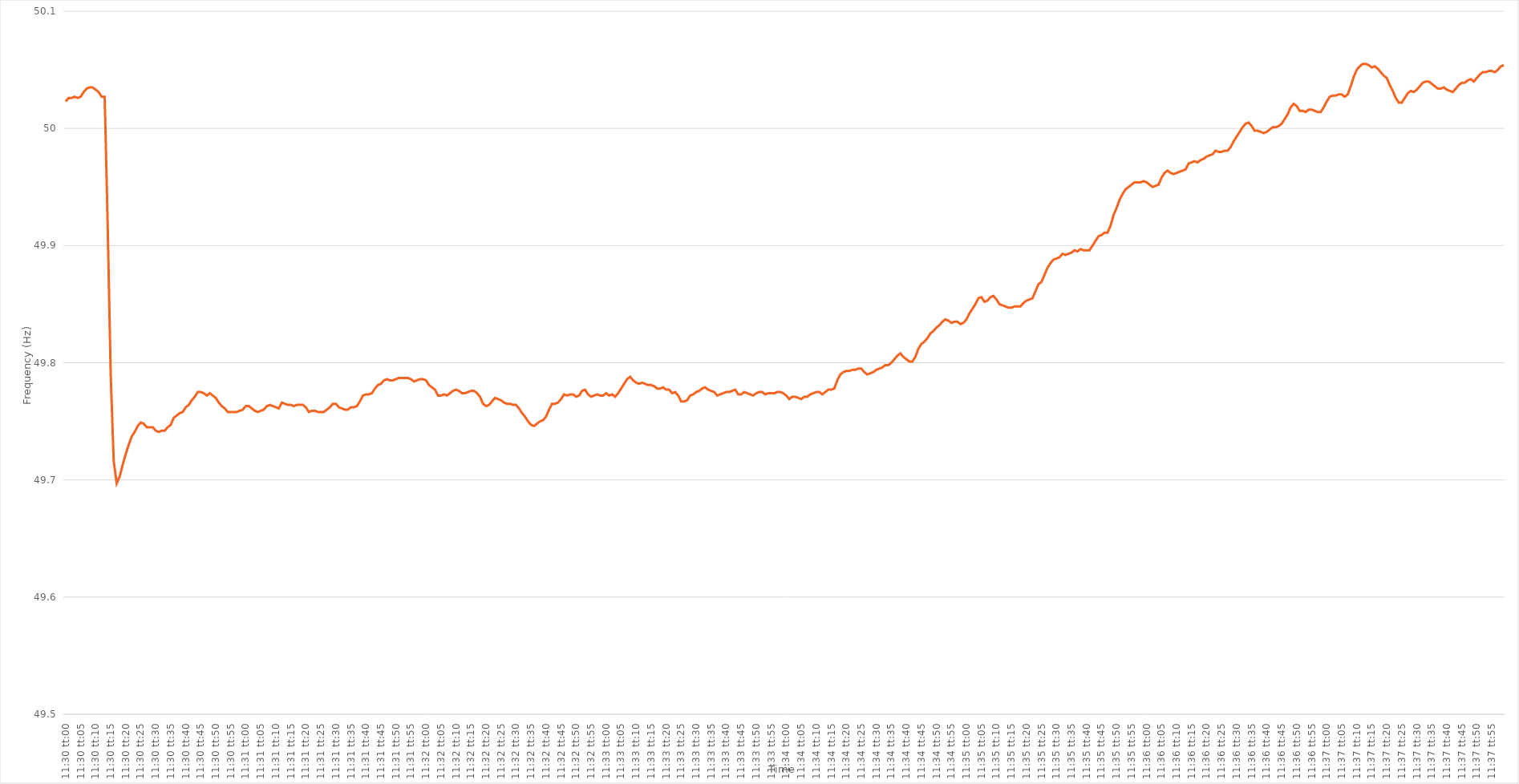
| Category | Series 0 |
|---|---|
| 0.4791666666666667 | 50.023 |
| 0.4791782407407407 | 50.026 |
| 0.4791898148148148 | 50.026 |
| 0.47920138888888886 | 50.027 |
| 0.47921296296296295 | 50.026 |
| 0.479224537037037 | 50.027 |
| 0.47923611111111114 | 50.031 |
| 0.4792476851851852 | 50.034 |
| 0.4792592592592593 | 50.035 |
| 0.4792708333333333 | 50.035 |
| 0.4792824074074074 | 50.033 |
| 0.47929398148148145 | 50.031 |
| 0.4793055555555556 | 50.027 |
| 0.47931712962962963 | 50.027 |
| 0.47932870370370373 | 49.917 |
| 0.47934027777777777 | 49.79 |
| 0.47935185185185186 | 49.716 |
| 0.4793634259259259 | 49.697 |
| 0.47937500000000005 | 49.703 |
| 0.4793865740740741 | 49.713 |
| 0.4793981481481482 | 49.722 |
| 0.4794097222222222 | 49.73 |
| 0.47942129629629626 | 49.737 |
| 0.47943287037037036 | 49.741 |
| 0.4794444444444444 | 49.746 |
| 0.47945601851851855 | 49.749 |
| 0.4794675925925926 | 49.748 |
| 0.4794791666666667 | 49.745 |
| 0.4794907407407407 | 49.745 |
| 0.4795023148148148 | 49.745 |
| 0.47951388888888885 | 49.742 |
| 0.479525462962963 | 49.741 |
| 0.47953703703703704 | 49.742 |
| 0.47954861111111113 | 49.742 |
| 0.4795601851851852 | 49.745 |
| 0.47957175925925927 | 49.747 |
| 0.4795833333333333 | 49.753 |
| 0.47959490740740746 | 49.755 |
| 0.4796064814814815 | 49.757 |
| 0.4796180555555556 | 49.758 |
| 0.47962962962962963 | 49.762 |
| 0.47964120370370367 | 49.764 |
| 0.47965277777777776 | 49.768 |
| 0.4796643518518518 | 49.771 |
| 0.47967592592592595 | 49.775 |
| 0.4796875 | 49.775 |
| 0.4796990740740741 | 49.774 |
| 0.4797106481481481 | 49.772 |
| 0.4797222222222222 | 49.774 |
| 0.47973379629629626 | 49.772 |
| 0.4797453703703704 | 49.77 |
| 0.47975694444444444 | 49.766 |
| 0.47976851851851854 | 49.763 |
| 0.4797800925925926 | 49.761 |
| 0.47979166666666667 | 49.758 |
| 0.4798032407407407 | 49.758 |
| 0.47981481481481486 | 49.758 |
| 0.4798263888888889 | 49.758 |
| 0.479837962962963 | 49.759 |
| 0.47984953703703703 | 49.76 |
| 0.4798611111111111 | 49.763 |
| 0.47987268518518517 | 49.763 |
| 0.4798842592592593 | 49.761 |
| 0.47989583333333335 | 49.759 |
| 0.4799074074074074 | 49.758 |
| 0.4799189814814815 | 49.759 |
| 0.4799305555555555 | 49.76 |
| 0.4799421296296296 | 49.763 |
| 0.47995370370370366 | 49.764 |
| 0.4799652777777778 | 49.763 |
| 0.47997685185185185 | 49.762 |
| 0.47998842592592594 | 49.761 |
| 0.48 | 49.766 |
| 0.4800115740740741 | 49.765 |
| 0.4800231481481481 | 49.764 |
| 0.48003472222222227 | 49.764 |
| 0.4800462962962963 | 49.763 |
| 0.4800578703703704 | 49.764 |
| 0.48006944444444444 | 49.764 |
| 0.48008101851851853 | 49.764 |
| 0.48009259259259257 | 49.762 |
| 0.4801041666666667 | 49.758 |
| 0.48011574074074076 | 49.759 |
| 0.4801273148148148 | 49.759 |
| 0.4801388888888889 | 49.758 |
| 0.48015046296296293 | 49.758 |
| 0.480162037037037 | 49.758 |
| 0.48017361111111106 | 49.76 |
| 0.4801851851851852 | 49.762 |
| 0.48019675925925925 | 49.765 |
| 0.48020833333333335 | 49.765 |
| 0.4802199074074074 | 49.762 |
| 0.4802314814814815 | 49.761 |
| 0.4802430555555555 | 49.76 |
| 0.48025462962962967 | 49.76 |
| 0.4802662037037037 | 49.762 |
| 0.4802777777777778 | 49.762 |
| 0.48028935185185184 | 49.763 |
| 0.48030092592592594 | 49.767 |
| 0.4803125 | 49.772 |
| 0.4803240740740741 | 49.773 |
| 0.48033564814814816 | 49.773 |
| 0.4803472222222222 | 49.774 |
| 0.4803587962962963 | 49.778 |
| 0.48037037037037034 | 49.781 |
| 0.48038194444444443 | 49.782 |
| 0.48039351851851847 | 49.785 |
| 0.4804050925925926 | 49.786 |
| 0.48041666666666666 | 49.785 |
| 0.48042824074074075 | 49.785 |
| 0.4804398148148148 | 49.786 |
| 0.4804513888888889 | 49.787 |
| 0.4804629629629629 | 49.787 |
| 0.4804745370370371 | 49.787 |
| 0.4804861111111111 | 49.787 |
| 0.4804976851851852 | 49.786 |
| 0.48050925925925925 | 49.784 |
| 0.48052083333333334 | 49.785 |
| 0.4805324074074074 | 49.786 |
| 0.48054398148148153 | 49.786 |
| 0.48055555555555557 | 49.785 |
| 0.48056712962962966 | 49.781 |
| 0.4805787037037037 | 49.779 |
| 0.48059027777777774 | 49.777 |
| 0.48060185185185184 | 49.772 |
| 0.4806134259259259 | 49.772 |
| 0.480625 | 49.773 |
| 0.48063657407407406 | 49.772 |
| 0.48064814814814816 | 49.774 |
| 0.4806597222222222 | 49.776 |
| 0.4806712962962963 | 49.777 |
| 0.48068287037037033 | 49.776 |
| 0.4806944444444445 | 49.774 |
| 0.4807060185185185 | 49.774 |
| 0.4807175925925926 | 49.775 |
| 0.48072916666666665 | 49.776 |
| 0.48074074074074075 | 49.776 |
| 0.4807523148148148 | 49.774 |
| 0.48076388888888894 | 49.771 |
| 0.480775462962963 | 49.765 |
| 0.48078703703703707 | 49.763 |
| 0.4807986111111111 | 49.764 |
| 0.4808101851851852 | 49.767 |
| 0.48082175925925924 | 49.77 |
| 0.4808333333333333 | 49.769 |
| 0.48084490740740743 | 49.768 |
| 0.48085648148148147 | 49.766 |
| 0.48086805555555556 | 49.765 |
| 0.4808796296296296 | 49.765 |
| 0.4808912037037037 | 49.764 |
| 0.48090277777777773 | 49.764 |
| 0.4809143518518519 | 49.761 |
| 0.4809259259259259 | 49.757 |
| 0.4809375 | 49.754 |
| 0.48094907407407406 | 49.75 |
| 0.48096064814814815 | 49.747 |
| 0.4809722222222222 | 49.746 |
| 0.48098379629629634 | 49.748 |
| 0.4809953703703704 | 49.75 |
| 0.4810069444444445 | 49.751 |
| 0.4810185185185185 | 49.754 |
| 0.4810300925925926 | 49.76 |
| 0.48104166666666665 | 49.765 |
| 0.4810532407407408 | 49.765 |
| 0.48106481481481483 | 49.766 |
| 0.4810763888888889 | 49.769 |
| 0.48108796296296297 | 49.773 |
| 0.481099537037037 | 49.772 |
| 0.4811111111111111 | 49.773 |
| 0.48112268518518514 | 49.773 |
| 0.4811342592592593 | 49.771 |
| 0.48114583333333333 | 49.772 |
| 0.4811574074074074 | 49.776 |
| 0.48116898148148146 | 49.777 |
| 0.48118055555555556 | 49.773 |
| 0.4811921296296296 | 49.771 |
| 0.48120370370370374 | 49.772 |
| 0.4812152777777778 | 49.773 |
| 0.4812268518518519 | 49.772 |
| 0.4812384259259259 | 49.772 |
| 0.48125 | 49.774 |
| 0.48126157407407405 | 49.772 |
| 0.4812731481481482 | 49.773 |
| 0.48128472222222224 | 49.771 |
| 0.48129629629629633 | 49.774 |
| 0.48130787037037037 | 49.778 |
| 0.4813194444444444 | 49.782 |
| 0.4813310185185185 | 49.786 |
| 0.48134259259259254 | 49.788 |
| 0.4813541666666667 | 49.785 |
| 0.48136574074074073 | 49.783 |
| 0.4813773148148148 | 49.782 |
| 0.48138888888888887 | 49.783 |
| 0.48140046296296296 | 49.782 |
| 0.481412037037037 | 49.781 |
| 0.48142361111111115 | 49.781 |
| 0.4814351851851852 | 49.78 |
| 0.4814467592592593 | 49.778 |
| 0.4814583333333333 | 49.778 |
| 0.4814699074074074 | 49.779 |
| 0.48148148148148145 | 49.777 |
| 0.4814930555555556 | 49.777 |
| 0.48150462962962964 | 49.774 |
| 0.48151620370370374 | 49.775 |
| 0.4815277777777778 | 49.772 |
| 0.4815393518518518 | 49.767 |
| 0.4815509259259259 | 49.767 |
| 0.48156249999999995 | 49.768 |
| 0.4815740740740741 | 49.772 |
| 0.48158564814814814 | 49.773 |
| 0.48159722222222223 | 49.775 |
| 0.48160879629629627 | 49.776 |
| 0.48162037037037037 | 49.778 |
| 0.4816319444444444 | 49.779 |
| 0.48164351851851855 | 49.777 |
| 0.4816550925925926 | 49.776 |
| 0.4816666666666667 | 49.775 |
| 0.4816782407407407 | 49.772 |
| 0.4816898148148148 | 49.773 |
| 0.48170138888888886 | 49.774 |
| 0.481712962962963 | 49.775 |
| 0.48172453703703705 | 49.775 |
| 0.48173611111111114 | 49.776 |
| 0.4817476851851852 | 49.777 |
| 0.4817592592592593 | 49.773 |
| 0.4817708333333333 | 49.773 |
| 0.48178240740740735 | 49.775 |
| 0.4817939814814815 | 49.774 |
| 0.48180555555555554 | 49.773 |
| 0.48181712962962964 | 49.772 |
| 0.4818287037037037 | 49.774 |
| 0.48184027777777777 | 49.775 |
| 0.4818518518518518 | 49.775 |
| 0.48186342592592596 | 49.773 |
| 0.481875 | 49.774 |
| 0.4818865740740741 | 49.774 |
| 0.48189814814814813 | 49.774 |
| 0.4819097222222222 | 49.775 |
| 0.48192129629629626 | 49.775 |
| 0.4819328703703704 | 49.774 |
| 0.48194444444444445 | 49.772 |
| 0.48195601851851855 | 49.769 |
| 0.4819675925925926 | 49.771 |
| 0.4819791666666667 | 49.771 |
| 0.4819907407407407 | 49.77 |
| 0.48200231481481487 | 49.769 |
| 0.4820138888888889 | 49.771 |
| 0.48202546296296295 | 49.771 |
| 0.48203703703703704 | 49.773 |
| 0.4820486111111111 | 49.774 |
| 0.4820601851851852 | 49.775 |
| 0.4820717592592592 | 49.775 |
| 0.48208333333333336 | 49.773 |
| 0.4820949074074074 | 49.775 |
| 0.4821064814814815 | 49.777 |
| 0.48211805555555554 | 49.777 |
| 0.48212962962962963 | 49.778 |
| 0.48214120370370367 | 49.785 |
| 0.4821527777777778 | 49.79 |
| 0.48216435185185186 | 49.792 |
| 0.48217592592592595 | 49.793 |
| 0.4821875 | 49.793 |
| 0.4821990740740741 | 49.794 |
| 0.4822106481481481 | 49.794 |
| 0.4822222222222223 | 49.795 |
| 0.4822337962962963 | 49.795 |
| 0.48224537037037035 | 49.792 |
| 0.48225694444444445 | 49.79 |
| 0.4822685185185185 | 49.791 |
| 0.4822800925925926 | 49.792 |
| 0.4822916666666666 | 49.794 |
| 0.48230324074074077 | 49.795 |
| 0.4823148148148148 | 49.796 |
| 0.4823263888888889 | 49.798 |
| 0.48233796296296294 | 49.798 |
| 0.48234953703703703 | 49.8 |
| 0.4823611111111111 | 49.803 |
| 0.4823726851851852 | 49.806 |
| 0.48238425925925926 | 49.808 |
| 0.48239583333333336 | 49.805 |
| 0.4824074074074074 | 49.803 |
| 0.4824189814814815 | 49.801 |
| 0.48243055555555553 | 49.801 |
| 0.4824421296296297 | 49.805 |
| 0.4824537037037037 | 49.812 |
| 0.4824652777777778 | 49.816 |
| 0.48247685185185185 | 49.818 |
| 0.4824884259259259 | 49.821 |
| 0.4825 | 49.825 |
| 0.482511574074074 | 49.827 |
| 0.4825231481481482 | 49.83 |
| 0.4825347222222222 | 49.832 |
| 0.4825462962962963 | 49.835 |
| 0.48255787037037035 | 49.837 |
| 0.48256944444444444 | 49.836 |
| 0.4825810185185185 | 49.834 |
| 0.48259259259259263 | 49.835 |
| 0.48260416666666667 | 49.835 |
| 0.48261574074074076 | 49.833 |
| 0.4826273148148148 | 49.834 |
| 0.4826388888888889 | 49.837 |
| 0.48265046296296293 | 49.842 |
| 0.4826620370370371 | 49.846 |
| 0.4826736111111111 | 49.85 |
| 0.4826851851851852 | 49.855 |
| 0.48269675925925926 | 49.856 |
| 0.48270833333333335 | 49.852 |
| 0.4827199074074074 | 49.853 |
| 0.48273148148148143 | 49.856 |
| 0.4827430555555556 | 49.857 |
| 0.4827546296296296 | 49.854 |
| 0.4827662037037037 | 49.85 |
| 0.48277777777777775 | 49.849 |
| 0.48278935185185184 | 49.848 |
| 0.4828009259259259 | 49.847 |
| 0.48281250000000003 | 49.847 |
| 0.48282407407407407 | 49.848 |
| 0.48283564814814817 | 49.848 |
| 0.4828472222222222 | 49.848 |
| 0.4828587962962963 | 49.851 |
| 0.48287037037037034 | 49.853 |
| 0.4828819444444445 | 49.854 |
| 0.4828935185185185 | 49.855 |
| 0.4829050925925926 | 49.861 |
| 0.48291666666666666 | 49.867 |
| 0.48292824074074076 | 49.869 |
| 0.4829398148148148 | 49.875 |
| 0.48295138888888894 | 49.881 |
| 0.482962962962963 | 49.885 |
| 0.482974537037037 | 49.888 |
| 0.4829861111111111 | 49.889 |
| 0.48299768518518515 | 49.89 |
| 0.48300925925925925 | 49.893 |
| 0.4830208333333333 | 49.892 |
| 0.48303240740740744 | 49.893 |
| 0.4830439814814815 | 49.894 |
| 0.48305555555555557 | 49.896 |
| 0.4830671296296296 | 49.895 |
| 0.4830787037037037 | 49.897 |
| 0.48309027777777774 | 49.896 |
| 0.4831018518518519 | 49.896 |
| 0.48311342592592593 | 49.896 |
| 0.483125 | 49.9 |
| 0.48313657407407407 | 49.904 |
| 0.48314814814814816 | 49.908 |
| 0.4831597222222222 | 49.909 |
| 0.48317129629629635 | 49.911 |
| 0.4831828703703704 | 49.911 |
| 0.4831944444444444 | 49.917 |
| 0.4832060185185185 | 49.926 |
| 0.48321759259259256 | 49.932 |
| 0.48322916666666665 | 49.939 |
| 0.4832407407407407 | 49.944 |
| 0.48325231481481484 | 49.948 |
| 0.4832638888888889 | 49.95 |
| 0.483275462962963 | 49.952 |
| 0.483287037037037 | 49.954 |
| 0.4832986111111111 | 49.954 |
| 0.48331018518518515 | 49.954 |
| 0.4833217592592593 | 49.955 |
| 0.48333333333333334 | 49.954 |
| 0.48334490740740743 | 49.952 |
| 0.48335648148148147 | 49.95 |
| 0.48336805555555556 | 49.951 |
| 0.4833796296296296 | 49.952 |
| 0.48339120370370375 | 49.958 |
| 0.4834027777777778 | 49.962 |
| 0.4834143518518519 | 49.964 |
| 0.4834259259259259 | 49.962 |
| 0.48343749999999996 | 49.961 |
| 0.48344907407407406 | 49.962 |
| 0.4834606481481481 | 49.963 |
| 0.48347222222222225 | 49.964 |
| 0.4834837962962963 | 49.965 |
| 0.4834953703703704 | 49.97 |
| 0.4835069444444444 | 49.971 |
| 0.4835185185185185 | 49.972 |
| 0.48353009259259255 | 49.971 |
| 0.4835416666666667 | 49.973 |
| 0.48355324074074074 | 49.974 |
| 0.48356481481481484 | 49.976 |
| 0.4835763888888889 | 49.977 |
| 0.48358796296296297 | 49.978 |
| 0.483599537037037 | 49.981 |
| 0.48361111111111116 | 49.98 |
| 0.4836226851851852 | 49.98 |
| 0.4836342592592593 | 49.981 |
| 0.48364583333333333 | 49.981 |
| 0.4836574074074074 | 49.984 |
| 0.48366898148148146 | 49.989 |
| 0.4836805555555555 | 49.993 |
| 0.48369212962962965 | 49.997 |
| 0.4837037037037037 | 50.001 |
| 0.4837152777777778 | 50.004 |
| 0.4837268518518518 | 50.005 |
| 0.4837384259259259 | 50.002 |
| 0.48374999999999996 | 49.998 |
| 0.4837615740740741 | 49.998 |
| 0.48377314814814815 | 49.997 |
| 0.48378472222222224 | 49.996 |
| 0.4837962962962963 | 49.997 |
| 0.4838078703703704 | 49.999 |
| 0.4838194444444444 | 50.001 |
| 0.48383101851851856 | 50.001 |
| 0.4838425925925926 | 50.002 |
| 0.4838541666666667 | 50.004 |
| 0.48386574074074074 | 50.008 |
| 0.48387731481481483 | 50.012 |
| 0.48388888888888887 | 50.018 |
| 0.483900462962963 | 50.021 |
| 0.48391203703703706 | 50.019 |
| 0.4839236111111111 | 50.015 |
| 0.4839351851851852 | 50.015 |
| 0.48394675925925923 | 50.014 |
| 0.4839583333333333 | 50.016 |
| 0.48396990740740736 | 50.016 |
| 0.4839814814814815 | 50.015 |
| 0.48399305555555555 | 50.014 |
| 0.48400462962962965 | 50.014 |
| 0.4840162037037037 | 50.018 |
| 0.4840277777777778 | 50.023 |
| 0.4840393518518518 | 50.027 |
| 0.48405092592592597 | 50.028 |
| 0.4840625 | 50.028 |
| 0.4840740740740741 | 50.029 |
| 0.48408564814814814 | 50.029 |
| 0.48409722222222223 | 50.027 |
| 0.4841087962962963 | 50.029 |
| 0.4841203703703704 | 50.036 |
| 0.48413194444444446 | 50.044 |
| 0.4841435185185185 | 50.05 |
| 0.4841550925925926 | 50.053 |
| 0.48416666666666663 | 50.055 |
| 0.48417824074074073 | 50.055 |
| 0.48418981481481477 | 50.054 |
| 0.4842013888888889 | 50.052 |
| 0.48421296296296296 | 50.053 |
| 0.48422453703703705 | 50.051 |
| 0.4842361111111111 | 50.048 |
| 0.4842476851851852 | 50.045 |
| 0.4842592592592592 | 50.043 |
| 0.4842708333333334 | 50.037 |
| 0.4842824074074074 | 50.032 |
| 0.4842939814814815 | 50.026 |
| 0.48430555555555554 | 50.022 |
| 0.48431712962962964 | 50.022 |
| 0.4843287037037037 | 50.026 |
| 0.48434027777777783 | 50.03 |
| 0.48435185185185187 | 50.032 |
| 0.48436342592592596 | 50.031 |
| 0.484375 | 50.033 |
| 0.48438657407407404 | 50.036 |
| 0.48439814814814813 | 50.039 |
| 0.48440972222222217 | 50.04 |
| 0.4844212962962963 | 50.04 |
| 0.48443287037037036 | 50.038 |
| 0.48444444444444446 | 50.036 |
| 0.4844560185185185 | 50.034 |
| 0.4844675925925926 | 50.034 |
| 0.4844791666666666 | 50.035 |
| 0.4844907407407408 | 50.033 |
| 0.4845023148148148 | 50.032 |
| 0.4845138888888889 | 50.031 |
| 0.48452546296296295 | 50.034 |
| 0.48453703703703704 | 50.037 |
| 0.4845486111111111 | 50.039 |
| 0.48456018518518523 | 50.039 |
| 0.48457175925925927 | 50.041 |
| 0.48458333333333337 | 50.042 |
| 0.4845949074074074 | 50.04 |
| 0.4846064814814815 | 50.043 |
| 0.48461805555555554 | 50.046 |
| 0.4846296296296296 | 50.048 |
| 0.4846412037037037 | 50.048 |
| 0.48465277777777777 | 50.049 |
| 0.48466435185185186 | 50.049 |
| 0.4846759259259259 | 50.048 |
| 0.4846875 | 50.05 |
| 0.48469907407407403 | 50.053 |
| 0.4847106481481482 | 50.054 |